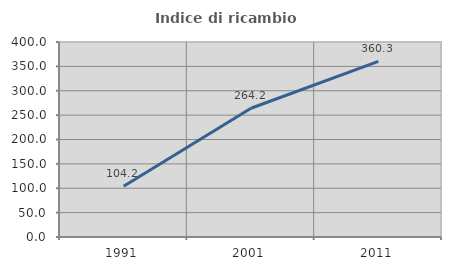
| Category | Indice di ricambio occupazionale  |
|---|---|
| 1991.0 | 104.167 |
| 2001.0 | 264.151 |
| 2011.0 | 360.317 |